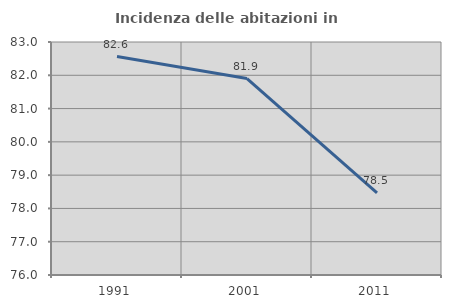
| Category | Incidenza delle abitazioni in proprietà  |
|---|---|
| 1991.0 | 82.564 |
| 2001.0 | 81.9 |
| 2011.0 | 78.467 |